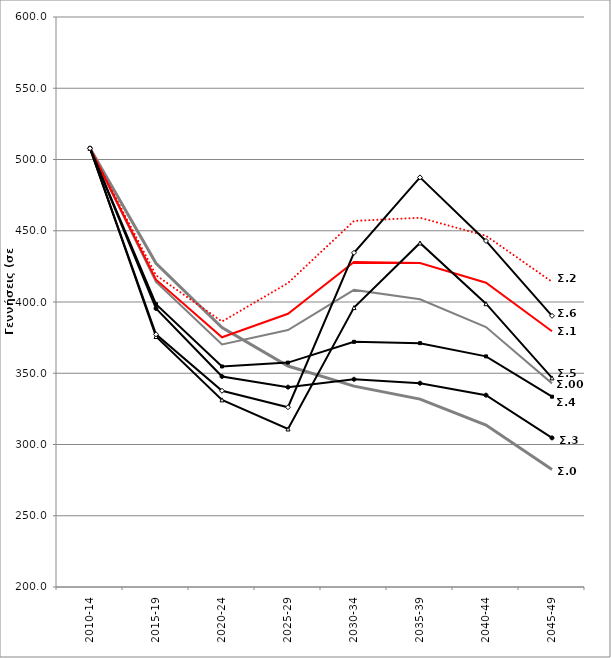
| Category | Γεννήσεις (χιλ.) | Σ5.Γεννήσεις (χιλ.) |
|---|---|---|
| 2010-14 | 507.847 | 507.847 |
| 2015-19 | 377.332 | 375.801 |
| 2020-24 | 337.708 | 331.321 |
| 2025-29 | 326.146 | 310.9 |
| 2030-34 | 434.502 | 396.089 |
| 2035-39 | 487.446 | 441.41 |
| 2040-44 | 442.857 | 398.813 |
| 2045-49 | 390.295 | 346.725 |